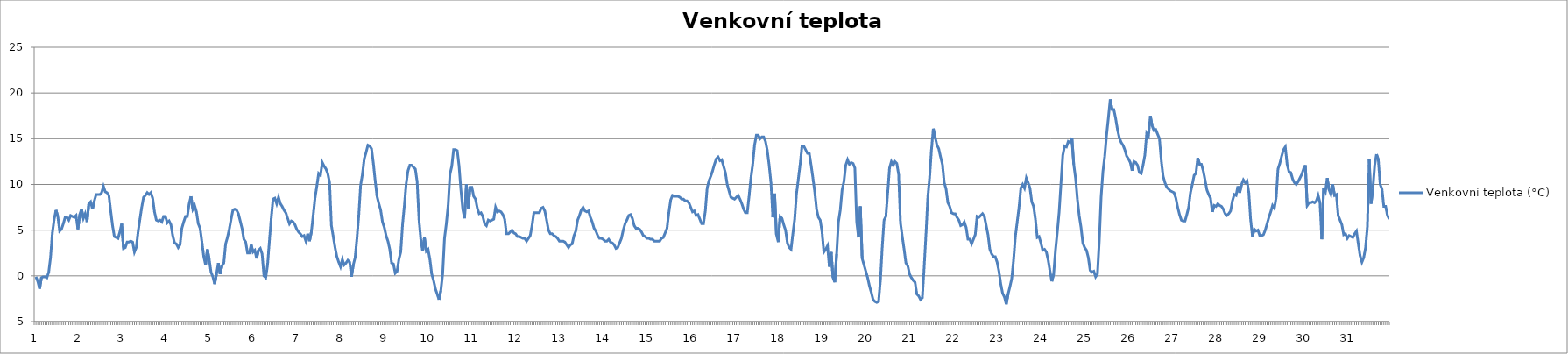
| Category | Venkovní teplota (°C) |
|---|---|
| 0 | -0.1 |
| 1 | -0.6 |
| 2 | -1.4 |
| 3 | -0.2 |
| 4 | -0.1 |
| 5 | -0.1 |
| 6 | -0.2 |
| 7 | 0.4 |
| 8 | 2 |
| 9 | 4.7 |
| 10 | 6.2 |
| 11 | 7.2 |
| 12 | 6.5 |
| 13 | 4.9 |
| 14 | 5.1 |
| 15 | 5.7 |
| 16 | 6.4 |
| 17 | 6.4 |
| 18 | 6.1 |
| 19 | 6.6 |
| 20 | 6.5 |
| 21 | 6.4 |
| 22 | 6.6 |
| 23 | 5.1 |
| 24 | 6.7 |
| 25 | 7.3 |
| 26 | 6.3 |
| 27 | 6.8 |
| 28 | 5.9 |
| 29 | 7.9 |
| 30 | 8.1 |
| 31 | 7.3 |
| 32 | 8.2 |
| 33 | 8.9 |
| 34 | 8.9 |
| 35 | 8.9 |
| 36 | 9.1 |
| 37 | 9.8 |
| 38 | 9.2 |
| 39 | 9.1 |
| 40 | 8.8 |
| 41 | 7.1 |
| 42 | 5.5 |
| 43 | 4.3 |
| 44 | 4.2 |
| 45 | 4.1 |
| 46 | 4.8 |
| 47 | 5.7 |
| 48 | 3 |
| 49 | 3.1 |
| 50 | 3.7 |
| 51 | 3.7 |
| 52 | 3.8 |
| 53 | 3.7 |
| 54 | 2.6 |
| 55 | 3.1 |
| 56 | 4.8 |
| 57 | 6.2 |
| 58 | 7.5 |
| 59 | 8.6 |
| 60 | 8.8 |
| 61 | 9.1 |
| 62 | 8.9 |
| 63 | 9.1 |
| 64 | 8.5 |
| 65 | 7 |
| 66 | 6.1 |
| 67 | 6 |
| 68 | 6.1 |
| 69 | 5.9 |
| 70 | 6.5 |
| 71 | 6.5 |
| 72 | 5.8 |
| 73 | 6 |
| 74 | 5.6 |
| 75 | 4.4 |
| 76 | 3.6 |
| 77 | 3.5 |
| 78 | 3.1 |
| 79 | 3.4 |
| 80 | 5.2 |
| 81 | 5.9 |
| 82 | 6.5 |
| 83 | 6.5 |
| 84 | 7.9 |
| 85 | 8.7 |
| 86 | 7.3 |
| 87 | 7.7 |
| 88 | 7 |
| 89 | 5.7 |
| 90 | 5.2 |
| 91 | 3.7 |
| 92 | 2.1 |
| 93 | 1.2 |
| 94 | 2.9 |
| 95 | 1.8 |
| 96 | 0.4 |
| 97 | -0.1 |
| 98 | -0.9 |
| 99 | 0.2 |
| 100 | 1.4 |
| 101 | 0.2 |
| 102 | 1.1 |
| 103 | 1.4 |
| 104 | 3.5 |
| 105 | 4.2 |
| 106 | 5.1 |
| 107 | 6.2 |
| 108 | 7.2 |
| 109 | 7.3 |
| 110 | 7.2 |
| 111 | 6.8 |
| 112 | 6 |
| 113 | 5.2 |
| 114 | 4 |
| 115 | 3.7 |
| 116 | 2.5 |
| 117 | 2.5 |
| 118 | 3.4 |
| 119 | 2.6 |
| 120 | 2.8 |
| 121 | 1.9 |
| 122 | 2.8 |
| 123 | 3 |
| 124 | 2.4 |
| 125 | 0 |
| 126 | -0.2 |
| 127 | 1.2 |
| 128 | 3.8 |
| 129 | 6.3 |
| 130 | 8.4 |
| 131 | 8.5 |
| 132 | 7.9 |
| 133 | 8.6 |
| 134 | 7.9 |
| 135 | 7.6 |
| 136 | 7.2 |
| 137 | 6.9 |
| 138 | 6.3 |
| 139 | 5.7 |
| 140 | 6 |
| 141 | 5.9 |
| 142 | 5.6 |
| 143 | 5.1 |
| 144 | 4.8 |
| 145 | 4.6 |
| 146 | 4.3 |
| 147 | 4.4 |
| 148 | 3.8 |
| 149 | 4.6 |
| 150 | 3.8 |
| 151 | 4.8 |
| 152 | 6.6 |
| 153 | 8.5 |
| 154 | 9.8 |
| 155 | 11.2 |
| 156 | 11 |
| 157 | 12.4 |
| 158 | 12 |
| 159 | 11.7 |
| 160 | 11.2 |
| 161 | 10.2 |
| 162 | 5.5 |
| 163 | 4.3 |
| 164 | 3.1 |
| 165 | 2.1 |
| 166 | 1.5 |
| 167 | 1 |
| 168 | 1.8 |
| 169 | 1.2 |
| 170 | 1.4 |
| 171 | 1.7 |
| 172 | 1.5 |
| 173 | -0.1 |
| 174 | 1.2 |
| 175 | 2 |
| 176 | 4.1 |
| 177 | 6.6 |
| 178 | 9.9 |
| 179 | 11.1 |
| 180 | 12.8 |
| 181 | 13.5 |
| 182 | 14.3 |
| 183 | 14.2 |
| 184 | 13.9 |
| 185 | 12.3 |
| 186 | 10.4 |
| 187 | 8.7 |
| 188 | 7.9 |
| 189 | 7.2 |
| 190 | 5.9 |
| 191 | 5.3 |
| 192 | 4.4 |
| 193 | 3.8 |
| 194 | 2.9 |
| 195 | 1.4 |
| 196 | 1.3 |
| 197 | 0.3 |
| 198 | 0.5 |
| 199 | 1.8 |
| 200 | 2.6 |
| 201 | 5.6 |
| 202 | 7.7 |
| 203 | 10.1 |
| 204 | 11.5 |
| 205 | 12.1 |
| 206 | 12.1 |
| 207 | 11.9 |
| 208 | 11.7 |
| 209 | 10.3 |
| 210 | 6.2 |
| 211 | 4 |
| 212 | 2.7 |
| 213 | 4.2 |
| 214 | 2.7 |
| 215 | 2.9 |
| 216 | 1.8 |
| 217 | 0.2 |
| 218 | -0.5 |
| 219 | -1.4 |
| 220 | -2 |
| 221 | -2.6 |
| 222 | -1.6 |
| 223 | 0.2 |
| 224 | 4.1 |
| 225 | 5.7 |
| 226 | 7.7 |
| 227 | 11.1 |
| 228 | 12 |
| 229 | 13.8 |
| 230 | 13.8 |
| 231 | 13.7 |
| 232 | 12 |
| 233 | 9.4 |
| 234 | 7.3 |
| 235 | 6.3 |
| 236 | 10 |
| 237 | 7.4 |
| 238 | 9.7 |
| 239 | 9.7 |
| 240 | 8.7 |
| 241 | 8.4 |
| 242 | 7.4 |
| 243 | 6.8 |
| 244 | 6.9 |
| 245 | 6.5 |
| 246 | 5.7 |
| 247 | 5.5 |
| 248 | 6.1 |
| 249 | 6 |
| 250 | 6.1 |
| 251 | 6.2 |
| 252 | 7.5 |
| 253 | 7 |
| 254 | 7.1 |
| 255 | 7 |
| 256 | 6.7 |
| 257 | 6.2 |
| 258 | 4.6 |
| 259 | 4.6 |
| 260 | 4.8 |
| 261 | 5 |
| 262 | 4.7 |
| 263 | 4.6 |
| 264 | 4.3 |
| 265 | 4.3 |
| 266 | 4.2 |
| 267 | 4.1 |
| 268 | 4.1 |
| 269 | 3.8 |
| 270 | 4.1 |
| 271 | 4.4 |
| 272 | 5.5 |
| 273 | 6.9 |
| 274 | 6.9 |
| 275 | 6.9 |
| 276 | 6.9 |
| 277 | 7.4 |
| 278 | 7.5 |
| 279 | 7.1 |
| 280 | 6.1 |
| 281 | 5 |
| 282 | 4.6 |
| 283 | 4.6 |
| 284 | 4.4 |
| 285 | 4.3 |
| 286 | 4.1 |
| 287 | 3.8 |
| 288 | 3.8 |
| 289 | 3.8 |
| 290 | 3.7 |
| 291 | 3.4 |
| 292 | 3.1 |
| 293 | 3.4 |
| 294 | 3.5 |
| 295 | 4.4 |
| 296 | 4.9 |
| 297 | 6.1 |
| 298 | 6.6 |
| 299 | 7.2 |
| 300 | 7.5 |
| 301 | 7.1 |
| 302 | 7 |
| 303 | 7.1 |
| 304 | 6.4 |
| 305 | 5.9 |
| 306 | 5.2 |
| 307 | 4.9 |
| 308 | 4.4 |
| 309 | 4.1 |
| 310 | 4.1 |
| 311 | 4 |
| 312 | 3.8 |
| 313 | 3.8 |
| 314 | 4 |
| 315 | 3.7 |
| 316 | 3.6 |
| 317 | 3.4 |
| 318 | 3 |
| 319 | 3.1 |
| 320 | 3.6 |
| 321 | 4.1 |
| 322 | 5 |
| 323 | 5.7 |
| 324 | 6.1 |
| 325 | 6.6 |
| 326 | 6.7 |
| 327 | 6.3 |
| 328 | 5.5 |
| 329 | 5.2 |
| 330 | 5.2 |
| 331 | 5.1 |
| 332 | 4.8 |
| 333 | 4.4 |
| 334 | 4.3 |
| 335 | 4.1 |
| 336 | 4.1 |
| 337 | 4 |
| 338 | 4 |
| 339 | 3.8 |
| 340 | 3.8 |
| 341 | 3.8 |
| 342 | 3.8 |
| 343 | 4.1 |
| 344 | 4.2 |
| 345 | 4.7 |
| 346 | 5.2 |
| 347 | 6.9 |
| 348 | 8.3 |
| 349 | 8.8 |
| 350 | 8.7 |
| 351 | 8.7 |
| 352 | 8.7 |
| 353 | 8.6 |
| 354 | 8.4 |
| 355 | 8.4 |
| 356 | 8.2 |
| 357 | 8.2 |
| 358 | 8 |
| 359 | 7.5 |
| 360 | 7 |
| 361 | 7.1 |
| 362 | 6.6 |
| 363 | 6.7 |
| 364 | 6.2 |
| 365 | 5.7 |
| 366 | 5.7 |
| 367 | 7.1 |
| 368 | 9.6 |
| 369 | 10.4 |
| 370 | 10.9 |
| 371 | 11.5 |
| 372 | 12.2 |
| 373 | 12.8 |
| 374 | 13 |
| 375 | 12.6 |
| 376 | 12.7 |
| 377 | 12 |
| 378 | 11.3 |
| 379 | 10 |
| 380 | 9.3 |
| 381 | 8.6 |
| 382 | 8.5 |
| 383 | 8.4 |
| 384 | 8.6 |
| 385 | 8.8 |
| 386 | 8.4 |
| 387 | 7.9 |
| 388 | 7.3 |
| 389 | 6.9 |
| 390 | 6.9 |
| 391 | 8.7 |
| 392 | 10.7 |
| 393 | 12.2 |
| 394 | 14.3 |
| 395 | 15.4 |
| 396 | 15.4 |
| 397 | 15 |
| 398 | 15.2 |
| 399 | 15.2 |
| 400 | 14.7 |
| 401 | 13.7 |
| 402 | 12.1 |
| 403 | 10.2 |
| 404 | 6.4 |
| 405 | 9 |
| 406 | 4.5 |
| 407 | 3.7 |
| 408 | 6.5 |
| 409 | 6.3 |
| 410 | 5.6 |
| 411 | 5 |
| 412 | 3.6 |
| 413 | 3.1 |
| 414 | 2.9 |
| 415 | 4.6 |
| 416 | 6.2 |
| 417 | 9 |
| 418 | 10.6 |
| 419 | 12.2 |
| 420 | 14.2 |
| 421 | 14.2 |
| 422 | 13.8 |
| 423 | 13.4 |
| 424 | 13.4 |
| 425 | 12.1 |
| 426 | 10.7 |
| 427 | 9.2 |
| 428 | 7.3 |
| 429 | 6.4 |
| 430 | 6.1 |
| 431 | 4.8 |
| 432 | 2.6 |
| 433 | 2.9 |
| 434 | 3.3 |
| 435 | 1 |
| 436 | 2.6 |
| 437 | -0.2 |
| 438 | -0.7 |
| 439 | 2.4 |
| 440 | 5.9 |
| 441 | 7.2 |
| 442 | 9.4 |
| 443 | 10.3 |
| 444 | 12.1 |
| 445 | 12.7 |
| 446 | 12.2 |
| 447 | 12.4 |
| 448 | 12.3 |
| 449 | 11.8 |
| 450 | 5.9 |
| 451 | 4.2 |
| 452 | 7.6 |
| 453 | 1.9 |
| 454 | 1.2 |
| 455 | 0.5 |
| 456 | -0.2 |
| 457 | -1.1 |
| 458 | -1.8 |
| 459 | -2.6 |
| 460 | -2.8 |
| 461 | -2.9 |
| 462 | -2.8 |
| 463 | -0.5 |
| 464 | 3.1 |
| 465 | 6.1 |
| 466 | 6.5 |
| 467 | 9.1 |
| 468 | 11.8 |
| 469 | 12.5 |
| 470 | 12.1 |
| 471 | 12.5 |
| 472 | 12.3 |
| 473 | 11.1 |
| 474 | 5.8 |
| 475 | 4.3 |
| 476 | 2.9 |
| 477 | 1.4 |
| 478 | 1.1 |
| 479 | 0.2 |
| 480 | -0.2 |
| 481 | -0.5 |
| 482 | -0.7 |
| 483 | -2 |
| 484 | -2.2 |
| 485 | -2.6 |
| 486 | -2.4 |
| 487 | 1 |
| 488 | 4.6 |
| 489 | 8.6 |
| 490 | 10.8 |
| 491 | 13.8 |
| 492 | 16.1 |
| 493 | 15.2 |
| 494 | 14.3 |
| 495 | 13.9 |
| 496 | 13 |
| 497 | 12.2 |
| 498 | 10.2 |
| 499 | 9.5 |
| 500 | 8 |
| 501 | 7.6 |
| 502 | 6.9 |
| 503 | 6.8 |
| 504 | 6.8 |
| 505 | 6.4 |
| 506 | 6.1 |
| 507 | 5.5 |
| 508 | 5.6 |
| 509 | 5.9 |
| 510 | 5.3 |
| 511 | 4 |
| 512 | 4 |
| 513 | 3.5 |
| 514 | 4 |
| 515 | 4.5 |
| 516 | 6.5 |
| 517 | 6.4 |
| 518 | 6.6 |
| 519 | 6.8 |
| 520 | 6.5 |
| 521 | 5.5 |
| 522 | 4.5 |
| 523 | 2.9 |
| 524 | 2.4 |
| 525 | 2.1 |
| 526 | 2.1 |
| 527 | 1.5 |
| 528 | 0.5 |
| 529 | -0.9 |
| 530 | -1.9 |
| 531 | -2.3 |
| 532 | -3.1 |
| 533 | -2 |
| 534 | -1.2 |
| 535 | -0.3 |
| 536 | 1.7 |
| 537 | 4.3 |
| 538 | 5.9 |
| 539 | 7.5 |
| 540 | 9.6 |
| 541 | 10 |
| 542 | 9.6 |
| 543 | 10.7 |
| 544 | 10.2 |
| 545 | 9.6 |
| 546 | 8.1 |
| 547 | 7.6 |
| 548 | 6.2 |
| 549 | 4.2 |
| 550 | 4.3 |
| 551 | 3.6 |
| 552 | 2.8 |
| 553 | 2.9 |
| 554 | 2.6 |
| 555 | 1.7 |
| 556 | 0.5 |
| 557 | -0.6 |
| 558 | 0.2 |
| 559 | 2.8 |
| 560 | 4.8 |
| 561 | 7 |
| 562 | 10.1 |
| 563 | 13.2 |
| 564 | 14.2 |
| 565 | 14.1 |
| 566 | 14.7 |
| 567 | 14.6 |
| 568 | 15.1 |
| 569 | 12.2 |
| 570 | 10.7 |
| 571 | 8.4 |
| 572 | 6.6 |
| 573 | 5.3 |
| 574 | 3.6 |
| 575 | 3.1 |
| 576 | 2.8 |
| 577 | 2 |
| 578 | 0.6 |
| 579 | 0.4 |
| 580 | 0.5 |
| 581 | -0.1 |
| 582 | 0.2 |
| 583 | 3.8 |
| 584 | 8.6 |
| 585 | 11.4 |
| 586 | 13.1 |
| 587 | 15.4 |
| 588 | 17.3 |
| 589 | 19.3 |
| 590 | 18.2 |
| 591 | 18.2 |
| 592 | 17.2 |
| 593 | 16 |
| 594 | 15.1 |
| 595 | 14.6 |
| 596 | 14.3 |
| 597 | 13.8 |
| 598 | 13.1 |
| 599 | 12.8 |
| 600 | 12.4 |
| 601 | 11.5 |
| 602 | 12.5 |
| 603 | 12.4 |
| 604 | 12.1 |
| 605 | 11.3 |
| 606 | 11.2 |
| 607 | 12.1 |
| 608 | 13.2 |
| 609 | 15.6 |
| 610 | 15.3 |
| 611 | 17.5 |
| 612 | 16.4 |
| 613 | 15.9 |
| 614 | 16 |
| 615 | 15.5 |
| 616 | 15 |
| 617 | 12.6 |
| 618 | 10.9 |
| 619 | 10.2 |
| 620 | 9.7 |
| 621 | 9.5 |
| 622 | 9.3 |
| 623 | 9.2 |
| 624 | 9.1 |
| 625 | 8.5 |
| 626 | 7.5 |
| 627 | 6.7 |
| 628 | 6.1 |
| 629 | 6 |
| 630 | 6 |
| 631 | 6.7 |
| 632 | 7.5 |
| 633 | 9.1 |
| 634 | 10 |
| 635 | 11 |
| 636 | 11.2 |
| 637 | 12.9 |
| 638 | 12.2 |
| 639 | 12.2 |
| 640 | 11.5 |
| 641 | 10.5 |
| 642 | 9.4 |
| 643 | 8.9 |
| 644 | 8.5 |
| 645 | 7 |
| 646 | 7.7 |
| 647 | 7.6 |
| 648 | 7.9 |
| 649 | 7.7 |
| 650 | 7.6 |
| 651 | 7.3 |
| 652 | 6.8 |
| 653 | 6.6 |
| 654 | 6.8 |
| 655 | 7.1 |
| 656 | 8.2 |
| 657 | 8.9 |
| 658 | 8.8 |
| 659 | 9.8 |
| 660 | 9.1 |
| 661 | 10 |
| 662 | 10.5 |
| 663 | 10.2 |
| 664 | 10.4 |
| 665 | 9.1 |
| 666 | 6.1 |
| 667 | 4.3 |
| 668 | 5.1 |
| 669 | 4.9 |
| 670 | 5 |
| 671 | 4.4 |
| 672 | 4.4 |
| 673 | 4.5 |
| 674 | 5 |
| 675 | 5.7 |
| 676 | 6.4 |
| 677 | 7 |
| 678 | 7.7 |
| 679 | 7.4 |
| 680 | 8.6 |
| 681 | 11.7 |
| 682 | 12.3 |
| 683 | 13.1 |
| 684 | 13.8 |
| 685 | 14.1 |
| 686 | 12.2 |
| 687 | 11.4 |
| 688 | 11.3 |
| 689 | 10.6 |
| 690 | 10.2 |
| 691 | 10 |
| 692 | 10.3 |
| 693 | 10.7 |
| 694 | 11.1 |
| 695 | 11.7 |
| 696 | 12.1 |
| 697 | 7.7 |
| 698 | 8 |
| 699 | 8 |
| 700 | 8.1 |
| 701 | 8 |
| 702 | 8.2 |
| 703 | 8.8 |
| 704 | 8 |
| 705 | 4 |
| 706 | 9.6 |
| 707 | 9.2 |
| 708 | 10.7 |
| 709 | 9.4 |
| 710 | 8.9 |
| 711 | 10 |
| 712 | 8.8 |
| 713 | 8.9 |
| 714 | 6.6 |
| 715 | 6.1 |
| 716 | 5.6 |
| 717 | 4.5 |
| 718 | 4.6 |
| 719 | 4.1 |
| 720 | 4.4 |
| 721 | 4.3 |
| 722 | 4.2 |
| 723 | 4.6 |
| 724 | 4.9 |
| 725 | 3.5 |
| 726 | 2.2 |
| 727 | 1.5 |
| 728 | 2 |
| 729 | 3.1 |
| 730 | 5.4 |
| 731 | 12.8 |
| 732 | 7.9 |
| 733 | 9.5 |
| 734 | 12.1 |
| 735 | 13.3 |
| 736 | 12.7 |
| 737 | 10 |
| 738 | 9.5 |
| 739 | 7.6 |
| 740 | 7.6 |
| 741 | 6.6 |
| 742 | 6.2 |